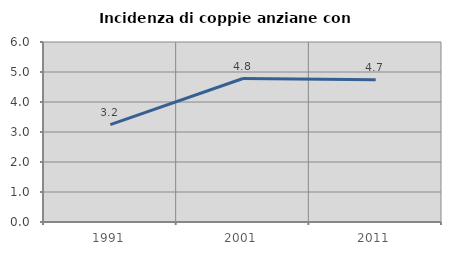
| Category | Incidenza di coppie anziane con figli |
|---|---|
| 1991.0 | 3.245 |
| 2001.0 | 4.782 |
| 2011.0 | 4.74 |